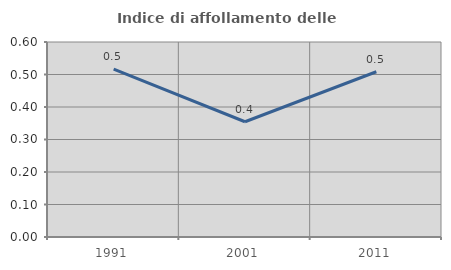
| Category | Indice di affollamento delle abitazioni  |
|---|---|
| 1991.0 | 0.516 |
| 2001.0 | 0.355 |
| 2011.0 | 0.508 |